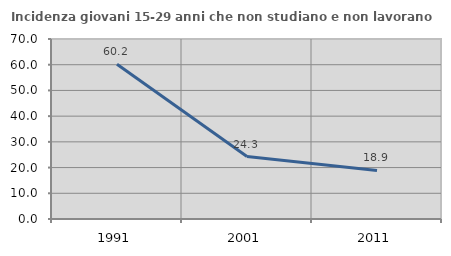
| Category | Incidenza giovani 15-29 anni che non studiano e non lavorano  |
|---|---|
| 1991.0 | 60.182 |
| 2001.0 | 24.272 |
| 2011.0 | 18.868 |